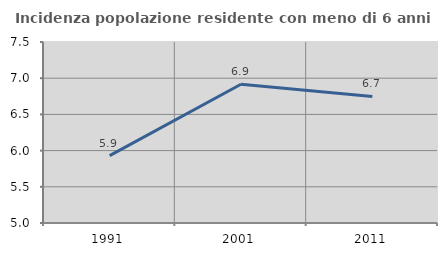
| Category | Incidenza popolazione residente con meno di 6 anni |
|---|---|
| 1991.0 | 5.931 |
| 2001.0 | 6.916 |
| 2011.0 | 6.749 |